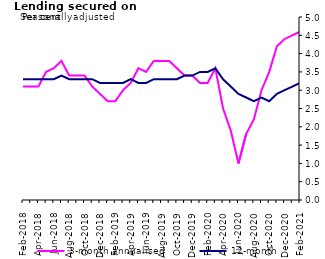
| Category | 3-month annualised | 12-month |
|---|---|---|
| Feb-2018 | 3.1 | 3.3 |
| Mar-2018 | 3.1 | 3.3 |
| Apr-2018 | 3.1 | 3.3 |
| May-2018 | 3.5 | 3.3 |
| Jun-2018 | 3.6 | 3.3 |
| Jul-2018 | 3.8 | 3.4 |
| Aug-2018 | 3.4 | 3.3 |
| Sep-2018 | 3.4 | 3.3 |
| Oct-2018 | 3.4 | 3.3 |
| Nov-2018 | 3.1 | 3.3 |
| Dec-2018 | 2.9 | 3.2 |
| Jan-2019 | 2.7 | 3.2 |
| Feb-2019 | 2.7 | 3.2 |
| Mar-2019 | 3 | 3.2 |
| Apr-2019 | 3.2 | 3.3 |
| May-2019 | 3.6 | 3.2 |
| Jun-2019 | 3.5 | 3.2 |
| Jul-2019 | 3.8 | 3.3 |
| Aug-2019 | 3.8 | 3.3 |
| Sep-2019 | 3.8 | 3.3 |
| Oct-2019 | 3.6 | 3.3 |
| Nov-2019 | 3.4 | 3.4 |
| Dec-2019 | 3.4 | 3.4 |
| Jan-2020 | 3.2 | 3.5 |
| Feb-2020 | 3.2 | 3.5 |
| Mar-2020 | 3.6 | 3.6 |
| Apr-2020 | 2.5 | 3.3 |
| May-2020 | 1.9 | 3.1 |
| Jun-2020 | 1 | 2.9 |
| Jul-2020 | 1.8 | 2.8 |
| Aug-2020 | 2.2 | 2.7 |
| Sep-2020 | 3 | 2.8 |
| Oct-2020 | 3.5 | 2.7 |
| Nov-2020 | 4.2 | 2.9 |
| Dec-2020 | 4.4 | 3 |
| Jan-2021 | 4.5 | 3.1 |
| Feb-2021 | 4.6 | 3.2 |